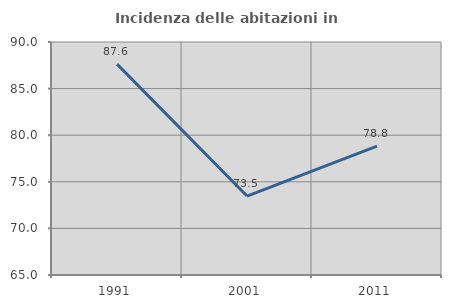
| Category | Incidenza delle abitazioni in proprietà  |
|---|---|
| 1991.0 | 87.629 |
| 2001.0 | 73.469 |
| 2011.0 | 78.824 |